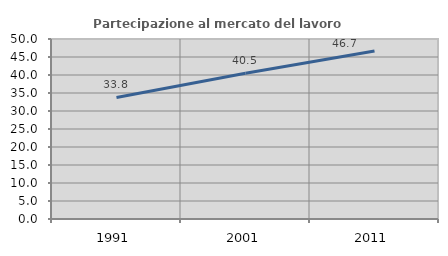
| Category | Partecipazione al mercato del lavoro  femminile |
|---|---|
| 1991.0 | 33.764 |
| 2001.0 | 40.475 |
| 2011.0 | 46.684 |